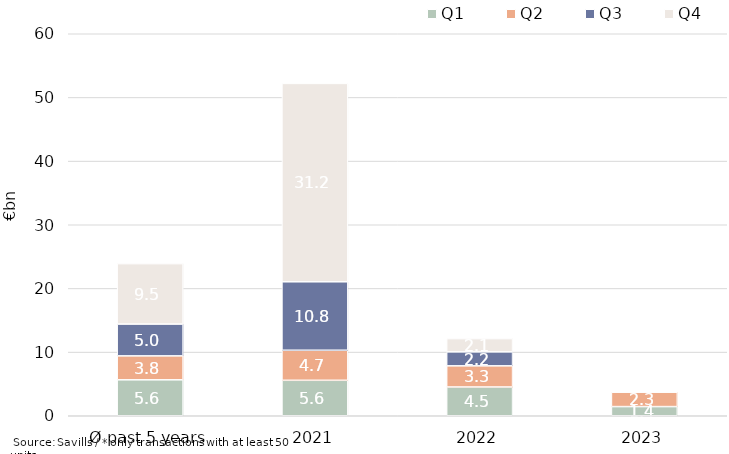
| Category | Q1 | Q2 | Q3 | Q4 |
|---|---|---|---|---|
| Ø past 5 years | 5646017558.366 | 3761292096.308 | 4997300272.744 | 9491257788.076 |
| 2021 | 5569888758 | 4721007645 | 10751893445.75 | 31156264639.5 |
| 2022 | 4520214286.54 | 3321253136 | 2192659976.13 | 2082641060 |
| 2023 | 1439417056.98 | 2257534495.42 | 0 | 0 |